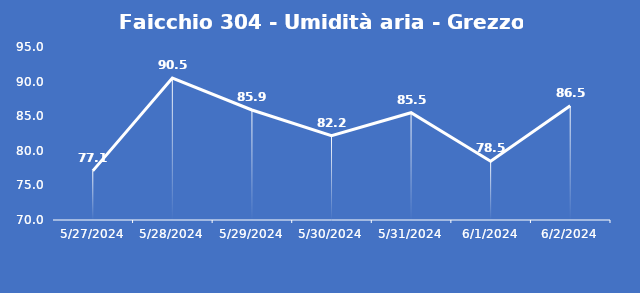
| Category | Faicchio 304 - Umidità aria - Grezzo (%) |
|---|---|
| 5/27/24 | 77.1 |
| 5/28/24 | 90.5 |
| 5/29/24 | 85.9 |
| 5/30/24 | 82.2 |
| 5/31/24 | 85.5 |
| 6/1/24 | 78.5 |
| 6/2/24 | 86.5 |